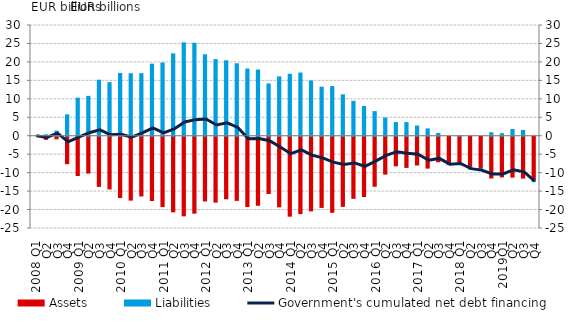
| Category | Assets | Liabilities |
|---|---|---|
| 2008 Q1 | 0 | 0 |
| Q2 | -0.851 | 0.372 |
| Q3 | -0.698 | 1.388 |
| Q4 | -7.444 | 5.798 |
| 2009 Q1 | -10.651 | 10.301 |
| Q2 | -9.986 | 10.798 |
| Q3 | -13.594 | 15.17 |
| Q4 | -14.283 | 14.52 |
| 2010 Q1 | -16.613 | 17.005 |
| Q2 | -17.314 | 16.929 |
| Q3 | -16.185 | 16.948 |
| Q4 | -17.416 | 19.527 |
| 2011 Q1 | -19.061 | 19.849 |
| Q2 | -20.485 | 22.309 |
| Q3 | -21.575 | 25.301 |
| Q4 | -20.841 | 25.195 |
| 2012 Q1 | -17.539 | 22.066 |
| Q2 | -17.847 | 20.761 |
| Q3 | -16.951 | 20.433 |
| Q4 | -17.379 | 19.629 |
| 2013 Q1 | -19.043 | 18.207 |
| Q2 | -18.703 | 17.929 |
| Q3 | -15.515 | 14.165 |
| Q4 | -19.124 | 16.074 |
| 2014 Q1 | -21.656 | 16.791 |
| Q2 | -20.959 | 17.124 |
| Q3 | -20.221 | 14.972 |
| Q4 | -19.295 | 13.303 |
| 2015 Q1 | -20.605 | 13.44 |
| Q2 | -19.008 | 11.22 |
| Q3 | -16.826 | 9.454 |
| Q4 | -16.33 | 8.051 |
| 2016 Q1 | -13.559 | 6.668 |
| Q2 | -10.267 | 4.929 |
| Q3 | -8.014 | 3.69 |
| Q4 | -8.453 | 3.701 |
| 2017 Q1 | -7.794 | 2.764 |
| Q2 | -8.64 | 1.985 |
| Q3 | -6.914 | 0.76 |
| Q4 | -7.648 | -0.06 |
| 2018 Q1 | -7.549 | 0.022 |
| Q2 | -8.346 | -0.577 |
| Q3 | -8.72 | -0.601 |
| Q4 | -11.312 | 0.947 |
| 2019Q1 | -11.022 | 0.676 |
| Q2 | -11.079 | 1.832 |
| Q3 | -11.336 | 1.563 |
| Q4 | -11.833 | -0.476 |